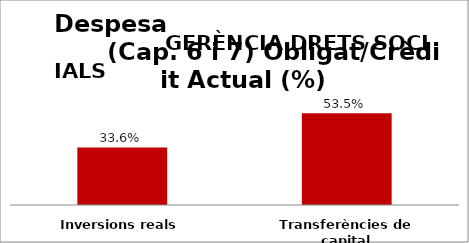
| Category | Series 0 |
|---|---|
| Inversions reals | 0.336 |
| Transferències de capital | 0.535 |